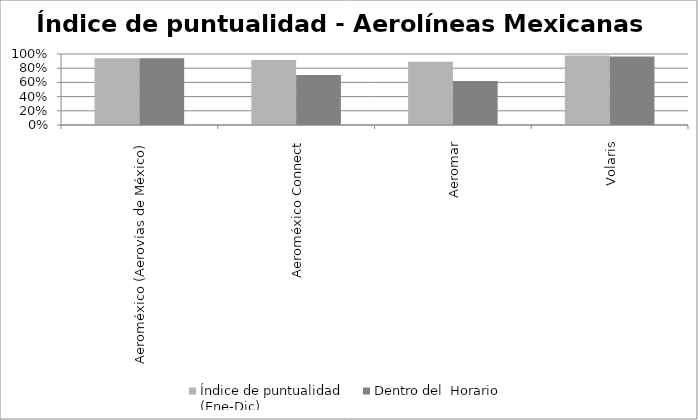
| Category | Índice de puntualidad
(Ene-Dic) | Dentro del  Horario |
|---|---|---|
| Aeroméxico (Aerovías de México) | 0.941 | 0.941 |
| Aeroméxico Connect | 0.914 | 0.705 |
| Aeromar | 0.889 | 0.62 |
| Volaris | 0.98 | 0.965 |